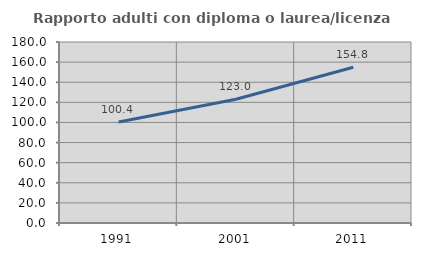
| Category | Rapporto adulti con diploma o laurea/licenza media  |
|---|---|
| 1991.0 | 100.368 |
| 2001.0 | 123.014 |
| 2011.0 | 154.845 |